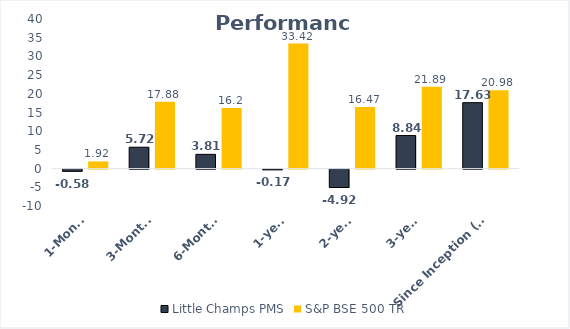
| Category | Little Champs PMS | S&P BSE 500 TR |
|---|---|---|
| 1-Month | -0.58 | 1.92 |
| 3-Months | 5.72 | 17.88 |
| 6-Months | 3.81 | 16.2 |
| 1-year | -0.17 | 33.42 |
| 2-year | -4.92 | 16.47 |
| 3-year | 8.84 | 21.89 |
| Since Inception (Annualised) | 17.63 | 20.98 |